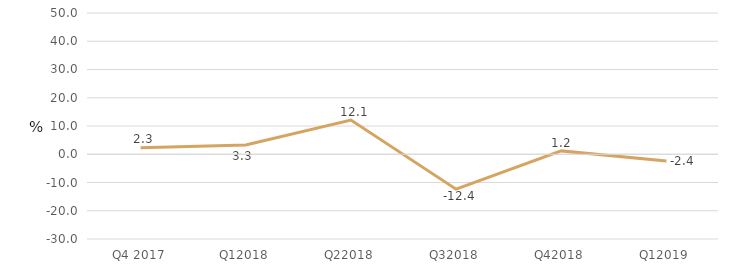
| Category | Series 0 |
|---|---|
| Q4 2017 | 2.272 |
| Q12018 | 3.266 |
| Q22018 | 12.116 |
| Q32018 | -12.365 |
| Q42018 | 1.191 |
| Q12019 | -2.381 |